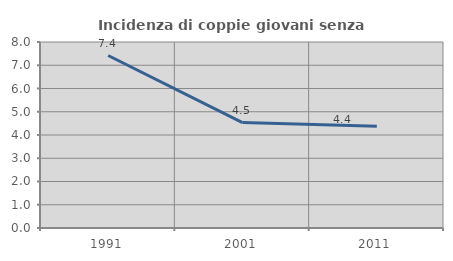
| Category | Incidenza di coppie giovani senza figli |
|---|---|
| 1991.0 | 7.418 |
| 2001.0 | 4.533 |
| 2011.0 | 4.373 |